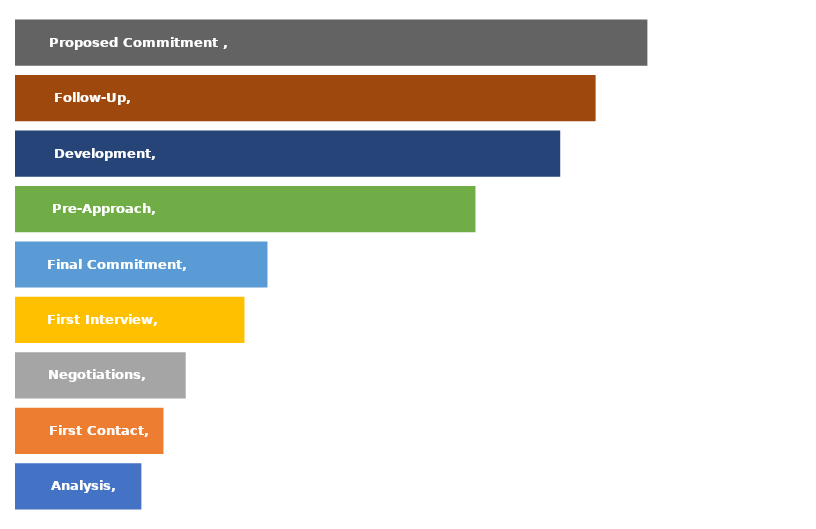
| Category | SALES FORECAST |
|---|---|
| Analysis | 38284 |
| First Contact | 45025 |
| Negotiations | 51821 |
| First Interview | 69758 |
| Final Commitment | 76787 |
| Pre-Approach | 140291 |
| Development | 166174 |
| Follow-Up | 176982 |
| Proposed Commitment  | 192792 |